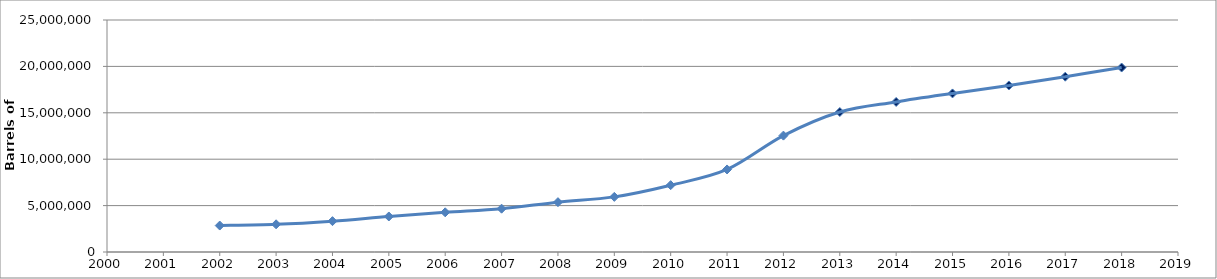
| Category | Series 0 |
|---|---|
| 2002.0 | 2850645.494 |
| 2003.0 | 2984002.174 |
| 2004.0 | 3324652.362 |
| 2005.0 | 3827248.805 |
| 2006.0 | 4277524.049 |
| 2007.0 | 4668871 |
| 2008.0 | 5370195.376 |
| 2009.0 | 5941798.742 |
| 2010.0 | 7201563.216 |
| 2011.0 | 8893546.806 |
| 2012.0 | 12540496.944 |
| 2013.0 | 15083184.348 |
| 2014.0 | 16173231.111 |
| 2015.0 | 17087956.459 |
| 2016.0 | 17945897.006 |
| 2017.0 | 18886672.874 |
| 2018.0 | 19877959.588 |